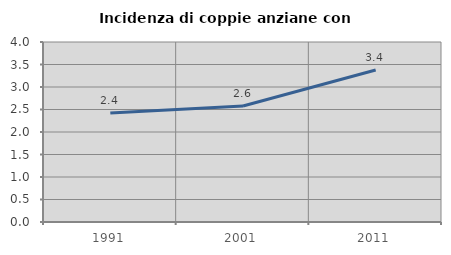
| Category | Incidenza di coppie anziane con figli |
|---|---|
| 1991.0 | 2.422 |
| 2001.0 | 2.577 |
| 2011.0 | 3.378 |